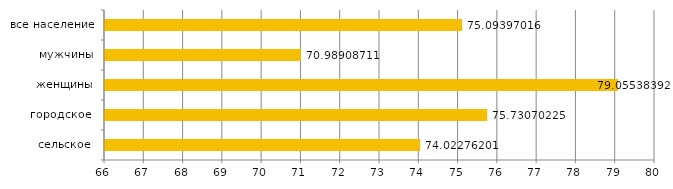
| Category | Series 3 |
|---|---|
| сельское  | 74.023 |
| городское  | 75.731 |
| женщины | 79.055 |
| мужчины | 70.989 |
| все население | 75.094 |